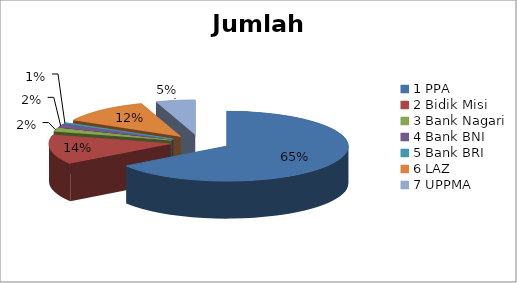
| Category | Jumlah Beasiswa | laki-laki | perempuan |
|---|---|---|---|
| 0 | 125 | 15 | 110 |
| 1 | 26 | 3 | 23 |
| 2 | 3 | 1 | 2 |
| 3 | 3 | 1 | 2 |
| 4 | 1 | 0 | 1 |
| 5 | 23 | 3 | 20 |
| 6 | 10 | 4 | 6 |